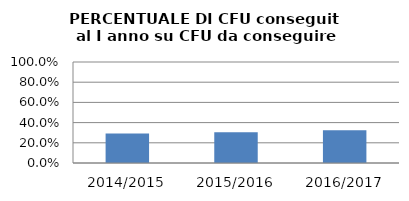
| Category | 2014/2015 2015/2016 2016/2017 |
|---|---|
| 2014/2015 | 0.292 |
| 2015/2016 | 0.306 |
| 2016/2017 | 0.325 |